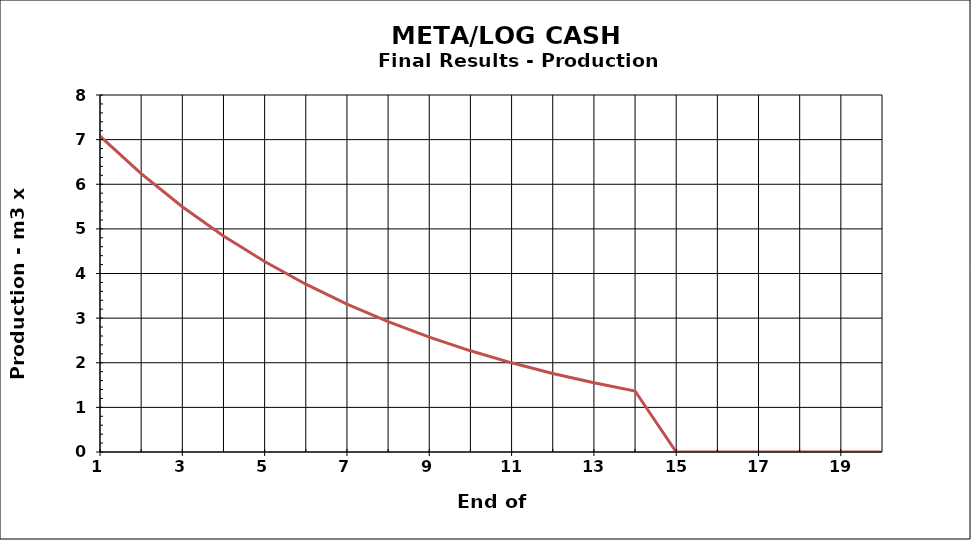
| Category | Series 1 |
|---|---|
| 1.0 | 7.076 |
| 2.0 | 6.236 |
| 3.0 | 5.495 |
| 4.0 | 4.842 |
| 5.0 | 4.267 |
| 6.0 | 3.76 |
| 7.0 | 3.314 |
| 8.0 | 2.92 |
| 9.0 | 2.573 |
| 10.0 | 2.268 |
| 11.0 | 1.998 |
| 12.0 | 1.761 |
| 13.0 | 1.552 |
| 14.0 | 1.367 |
| 15.0 | 0 |
| 16.0 | 0 |
| 17.0 | 0 |
| 18.0 | 0 |
| 19.0 | 0 |
| 20.0 | 0 |